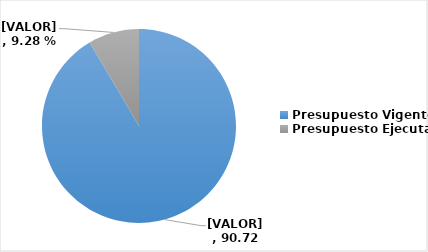
| Category | Series 0 |
|---|---|
| Presupuesto Vigente | 200974100 |
| Presupuesto Ejecutado | 18653692.1 |